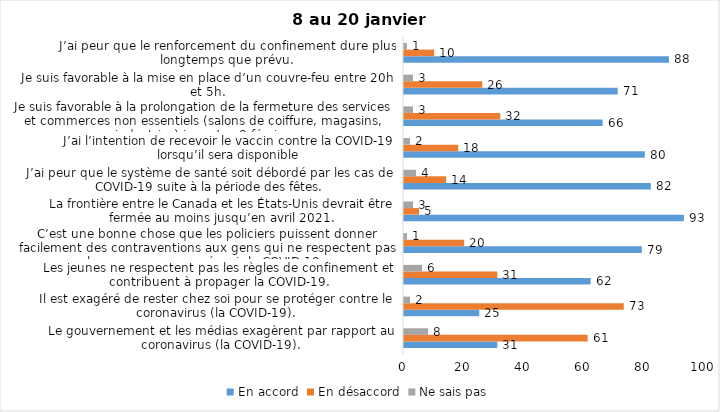
| Category | En accord | En désaccord | Ne sais pas |
|---|---|---|---|
| Le gouvernement et les médias exagèrent par rapport au coronavirus (la COVID-19). | 31 | 61 | 8 |
| Il est exagéré de rester chez soi pour se protéger contre le coronavirus (la COVID-19). | 25 | 73 | 2 |
| Les jeunes ne respectent pas les règles de confinement et contribuent à propager la COVID-19. | 62 | 31 | 6 |
| C’est une bonne chose que les policiers puissent donner facilement des contraventions aux gens qui ne respectent pas les mesures pour prévenir la COVID-19. | 79 | 20 | 1 |
| La frontière entre le Canada et les États-Unis devrait être fermée au moins jusqu’en avril 2021. | 93 | 5 | 3 |
| J’ai peur que le système de santé soit débordé par les cas de COVID-19 suite à la période des fêtes. | 82 | 14 | 4 |
| J’ai l’intention de recevoir le vaccin contre la COVID-19 lorsqu’il sera disponible | 80 | 18 | 2 |
| Je suis favorable à la prolongation de la fermeture des services et commerces non essentiels (salons de coiffure, magasins, industries) jusqu’au 8 février. | 66 | 32 | 3 |
| Je suis favorable à la mise en place d’un couvre-feu entre 20h et 5h. | 71 | 26 | 3 |
| J’ai peur que le renforcement du confinement dure plus longtemps que prévu. | 88 | 10 | 1 |